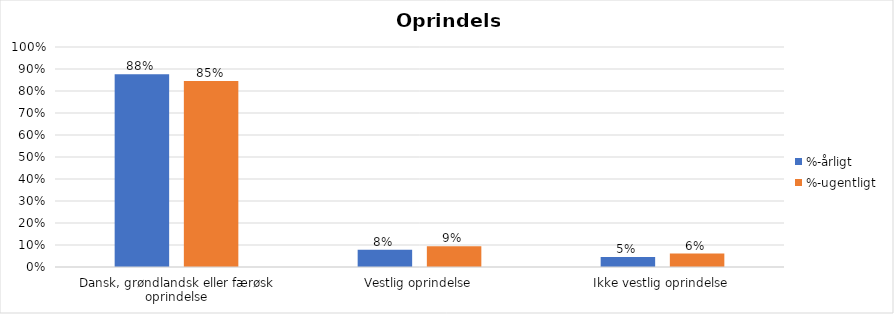
| Category | %-årligt | %-ugentligt |
|---|---|---|
| Dansk, grøndlandsk eller færøsk oprindelse | 0.877 | 0.845 |
| Vestlig oprindelse | 0.078 | 0.094 |
| Ikke vestlig oprindelse | 0.045 | 0.061 |